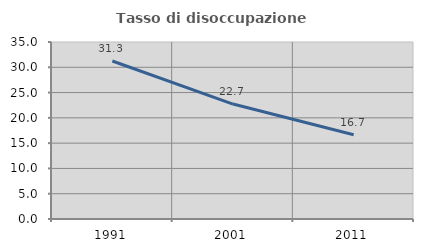
| Category | Tasso di disoccupazione giovanile  |
|---|---|
| 1991.0 | 31.25 |
| 2001.0 | 22.727 |
| 2011.0 | 16.667 |